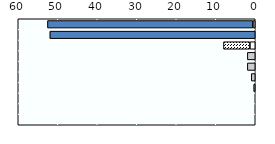
| Category | Paternity leave | Father-specific parental and homecare leave |
|---|---|---|
| Korea | 0.6 | 52 |
| Japan | 0 | 52 |
| OECD average | 1.351 | 6.699 |
| Australia | 2 | 0 |
| Singapore | 2 | 0 |
| Viet Nam | 1 | 0 |
| Indonesia | 0.4 | 0 |
| New Zealand | 0 | 0 |
| Thailand | 0 | 0 |
| China | 0 | 0 |